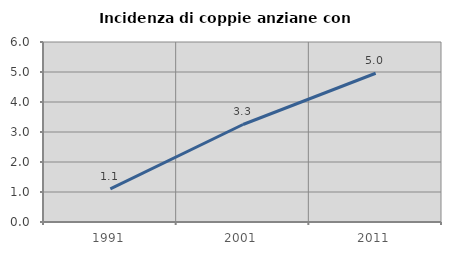
| Category | Incidenza di coppie anziane con figli |
|---|---|
| 1991.0 | 1.101 |
| 2001.0 | 3.25 |
| 2011.0 | 4.959 |